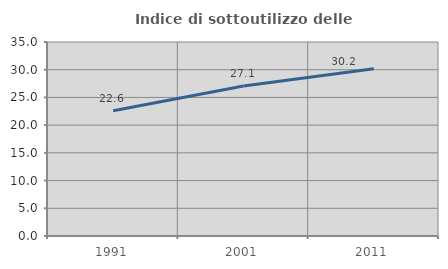
| Category | Indice di sottoutilizzo delle abitazioni  |
|---|---|
| 1991.0 | 22.587 |
| 2001.0 | 27.056 |
| 2011.0 | 30.176 |